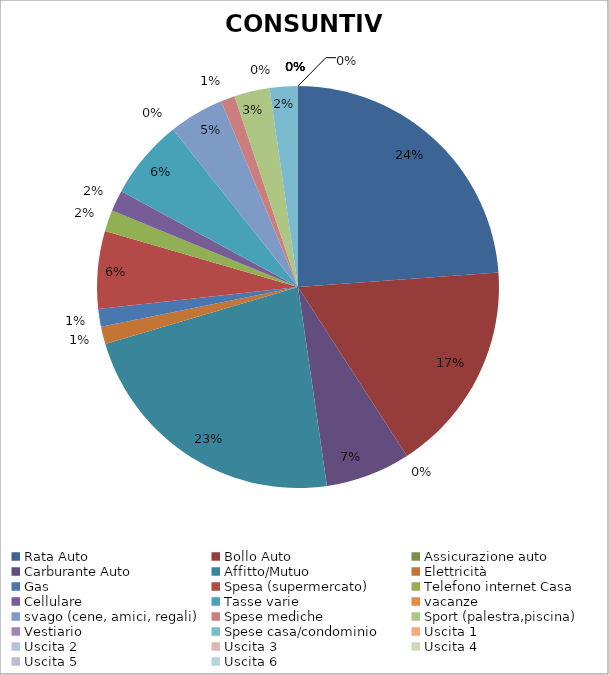
| Category | Budget |
|---|---|
| Rata Auto | 420 |
| Bollo Auto | 300 |
| Assicurazione auto | 0 |
| Carburante Auto | 120 |
| Affitto/Mutuo | 400 |
| Elettricità | 25 |
| Gas | 25 |
| Spesa (supermercato) | 110 |
| Telefono internet Casa | 30 |
| Cellulare | 30 |
| Tasse varie | 113 |
| vacanze | 0 |
| svago (cene, amici, regali) | 78 |
| Spese mediche | 20 |
| Sport (palestra,piscina) | 50 |
| Vestiario | 0 |
| Spese casa/condominio | 40 |
| Uscita 1 | 0 |
| Uscita 2 | 0 |
| Uscita 3 | 0 |
| Uscita 4 | 0 |
| Uscita 5 | 0 |
| Uscita 6 | 0 |